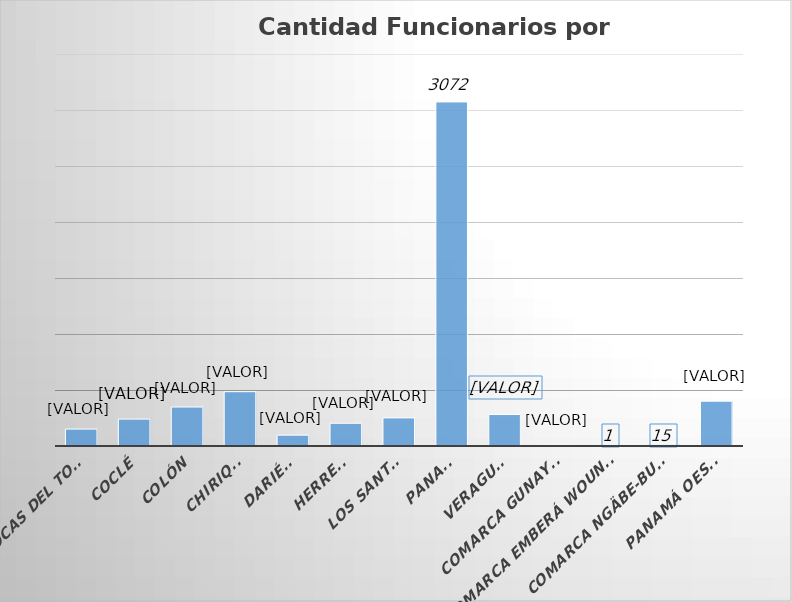
| Category | Cantidad  |
|---|---|
| BOCAS DEL TORO | 151 |
| COCLÉ | 240 |
| COLÓN | 348 |
| CHIRIQUÍ | 485 |
| DARIÉN | 97 |
| HERRERA | 203 |
| LOS SANTOS | 251 |
| PANAMÁ | 3072 |
| VERAGUAS | 281 |
| COMARCA GUNAYALA | 7 |
| COMARCA EMBERÁ WOUNAAN | 1 |
| COMARCA NGÄBE-BUGLÉ | 15 |
| PANAMÁ OESTE | 400 |